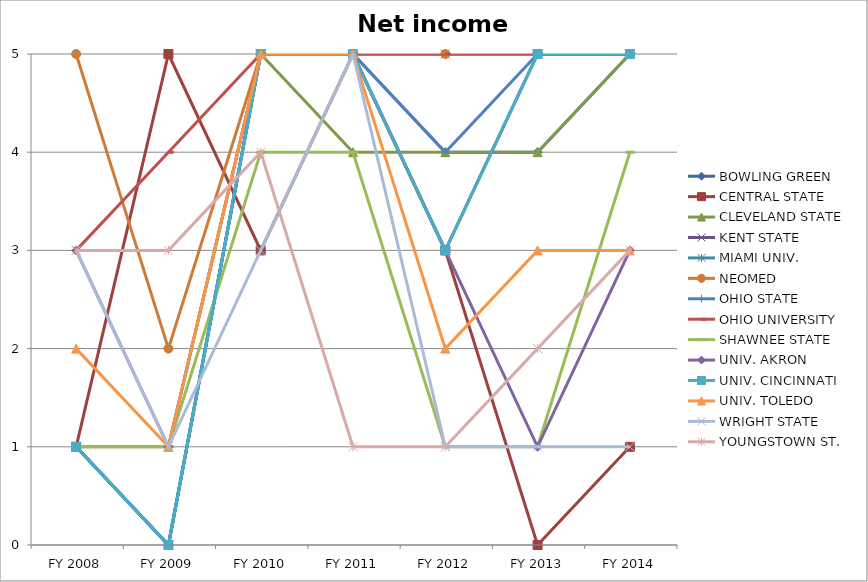
| Category | BOWLING GREEN  | CENTRAL STATE  | CLEVELAND STATE  | KENT STATE  | MIAMI UNIV.  | NEOMED  | OHIO STATE  | OHIO UNIVERSITY  | SHAWNEE STATE  | UNIV. AKRON  | UNIV. CINCINNATI  | UNIV. TOLEDO  | WRIGHT STATE  | YOUNGSTOWN ST.  |
|---|---|---|---|---|---|---|---|---|---|---|---|---|---|---|
| FY 2014 | 5 | 1 | 5 | 5 | 5 | 5 | 5 | 5 | 4 | 3 | 5 | 3 | 1 | 3 |
| FY 2013 | 4 | 0 | 4 | 5 | 5 | 5 | 5 | 5 | 1 | 1 | 5 | 3 | 1 | 2 |
| FY 2012 | 4 | 3 | 4 | 3 | 5 | 5 | 4 | 5 | 1 | 3 | 3 | 2 | 1 | 1 |
| FY 2011 | 5 | 5 | 4 | 5 | 5 | 5 | 5 | 5 | 4 | 5 | 5 | 5 | 5 | 1 |
| FY 2010 | 5 | 3 | 5 | 5 | 5 | 5 | 5 | 5 | 4 | 5 | 5 | 5 | 3 | 4 |
| FY 2009 | 0 | 5 | 1 | 0 | 0 | 2 | 0 | 4 | 1 | 1 | 0 | 1 | 1 | 3 |
| FY 2008 | 1 | 1 | 1 | 1 | 1 | 5 | 1 | 3 | 1 | 3 | 1 | 2 | 3 | 3 |